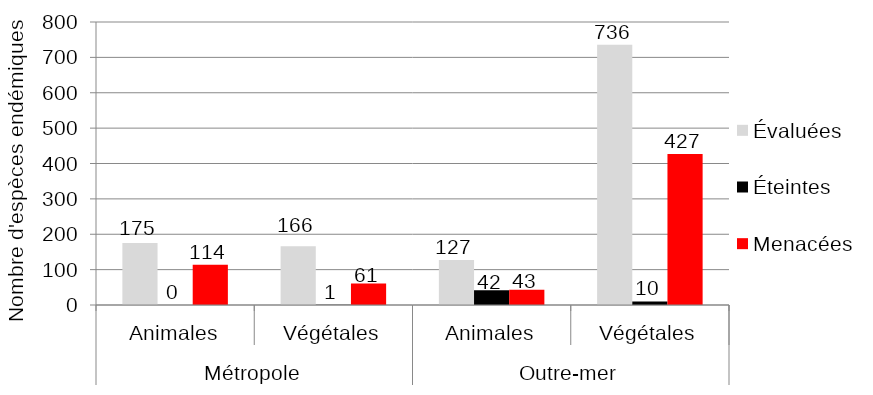
| Category | Évaluées  | Éteintes | Menacées |
|---|---|---|---|
| 0 | 175 | 0 | 114 |
| 1 | 166 | 1 | 61 |
| 2 | 127 | 42 | 43 |
| 3 | 736 | 10 | 427 |